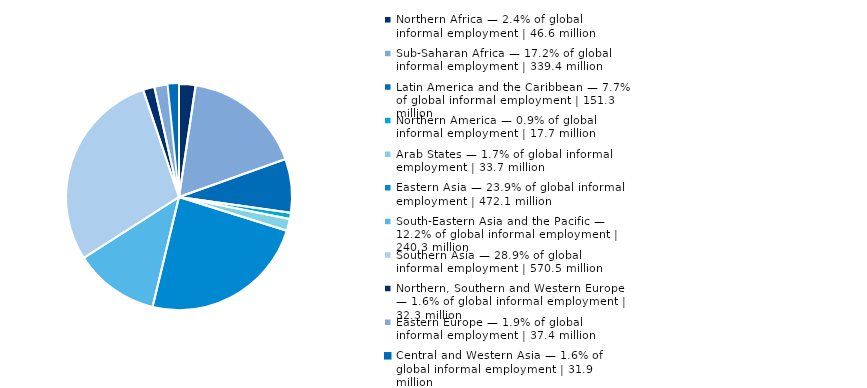
| Category | Series 0 |
|---|---|
| Northern Africa — 2.4% of global informal employment | 46.6 million | 2.36 |
| Sub-Saharan Africa — 17.2% of global informal employment | 339.4 million | 17.2 |
| Latin America and the Caribbean — 7.7% of global informal employment | 151.3 million | 7.668 |
| Northern America — 0.9% of global informal employment | 17.7 million | 0.896 |
| Arab States — 1.7% of global informal employment | 33.7 million | 1.706 |
| Eastern Asia — 23.9% of global informal employment | 472.1 million | 23.926 |
| South-Eastern Asia and the Pacific — 12.2% of global informal employment | 240.3 million | 12.179 |
| Southern Asia — 28.9% of global informal employment | 570.5 million | 28.916 |
| Northern, Southern and Western Europe — 1.6% of global informal employment | 32.3 million | 1.636 |
| Eastern Europe — 1.9% of global informal employment | 37.4 million | 1.896 |
| Central and Western Asia — 1.6% of global informal employment | 31.9 million | 1.617 |